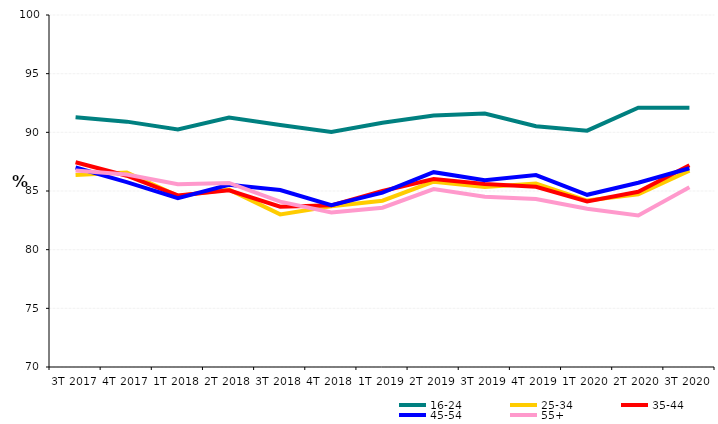
| Category | 16-24 | 25-34 | 35-44 | 45-54 | 55+ |
|---|---|---|---|---|---|
| 3T 2017 | 91.284 | 86.362 | 87.454 | 87.005 | 86.75 |
| 4T 2017 | 90.911 | 86.567 | 86.302 | 85.756 | 86.412 |
| 1T 2018 | 90.253 | 84.582 | 84.627 | 84.392 | 85.573 |
| 2T 2018 | 91.259 | 85.119 | 85.062 | 85.527 | 85.689 |
| 3T 2018 | 90.632 | 83.005 | 83.657 | 85.08 | 84.098 |
| 4T 2018 | 90.031 | 83.701 | 83.781 | 83.798 | 83.164 |
| 1T 2019 | 90.816 | 84.176 | 85.003 | 84.856 | 83.576 |
| 2T 2019 | 91.425 | 85.797 | 86.023 | 86.604 | 85.16 |
| 3T 2019 | 91.595 | 85.347 | 85.592 | 85.917 | 84.513 |
| 4T 2019 | 90.521 | 85.639 | 85.355 | 86.356 | 84.311 |
| 1T 2020 | 90.146 | 84.186 | 84.114 | 84.676 | 83.491 |
| 2T 2020 | 92.106 | 84.718 | 84.937 | 85.7 | 82.92 |
| 3T 2020 | 92.096 | 86.733 | 87.193 | 86.936 | 85.322 |